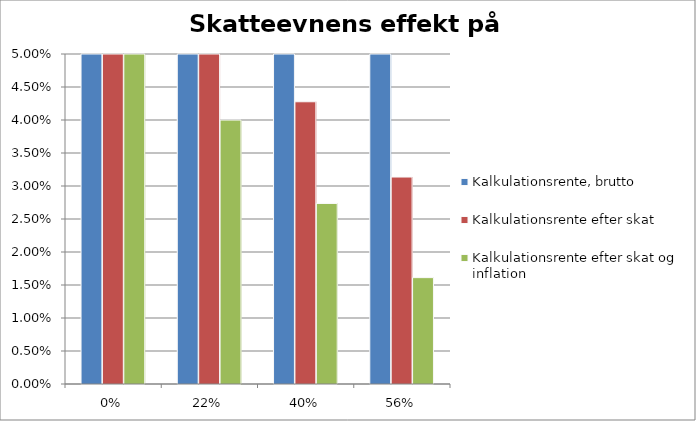
| Category | Kalkulationsrente, brutto | Kalkulationsrente efter skat | Kalkulationsrente efter skat og inflation |
|---|---|---|---|
| 0.0 | 0.071 | 0.071 | 0.055 |
| 0.22 | 0.071 | 0.056 | 0.04 |
| 0.4 | 0.071 | 0.043 | 0.027 |
| 0.56 | 0.071 | 0.031 | 0.016 |